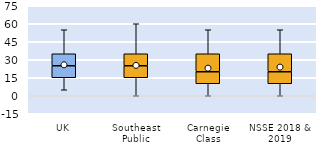
| Category | 25th | 50th | 75th |
|---|---|---|---|
| UK | 15 | 10 | 10 |
| Southeast Public | 15 | 10 | 10 |
| Carnegie Class | 10 | 10 | 15 |
| NSSE 2018 & 2019 | 10 | 10 | 15 |